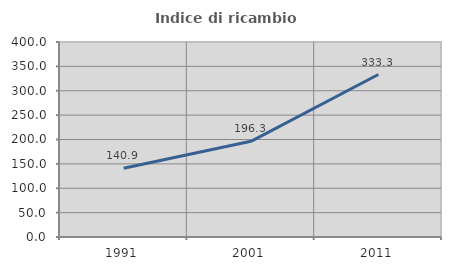
| Category | Indice di ricambio occupazionale  |
|---|---|
| 1991.0 | 140.909 |
| 2001.0 | 196.296 |
| 2011.0 | 333.333 |